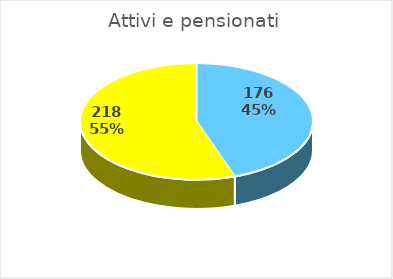
| Category | Attivi e pensionati |
|---|---|
| attivi | 176 |
| pensionati | 218 |